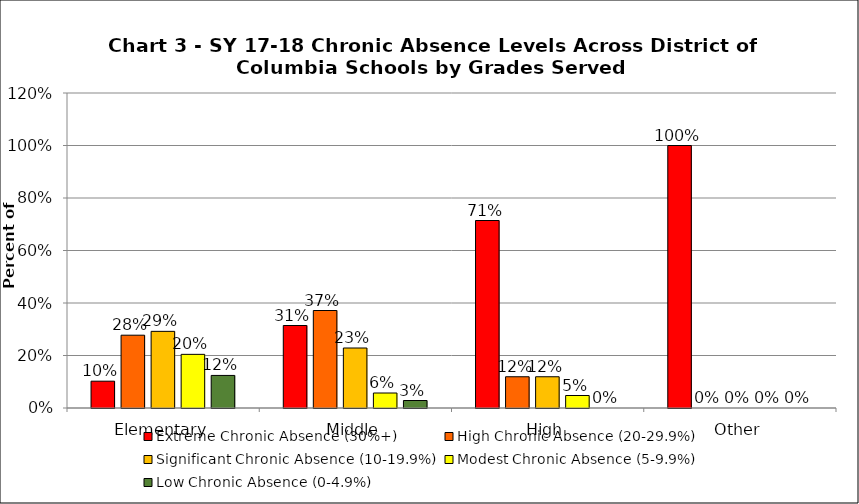
| Category | Extreme Chronic Absence (30%+) | High Chronic Absence (20-29.9%) | Significant Chronic Absence (10-19.9%) | Modest Chronic Absence (5-9.9%) | Low Chronic Absence (0-4.9%) |
|---|---|---|---|---|---|
| 0 | 0.102 | 0.277 | 0.292 | 0.204 | 0.124 |
| 1 | 0.314 | 0.371 | 0.229 | 0.057 | 0.029 |
| 2 | 0.714 | 0.119 | 0.119 | 0.048 | 0 |
| 3 | 1 | 0 | 0 | 0 | 0 |